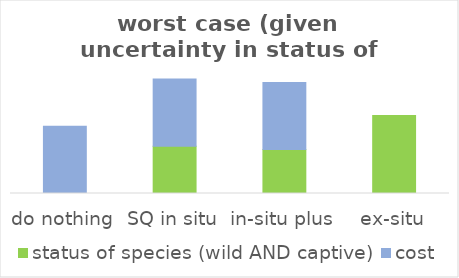
| Category | status of species (wild AND captive) | cost |
|---|---|---|
| do nothing | 0 | 0.167 |
| SQ in situ | 0.117 | 0.167 |
| in-situ plus | 0.109 | 0.167 |
| ex-situ | 0.193 | 0 |